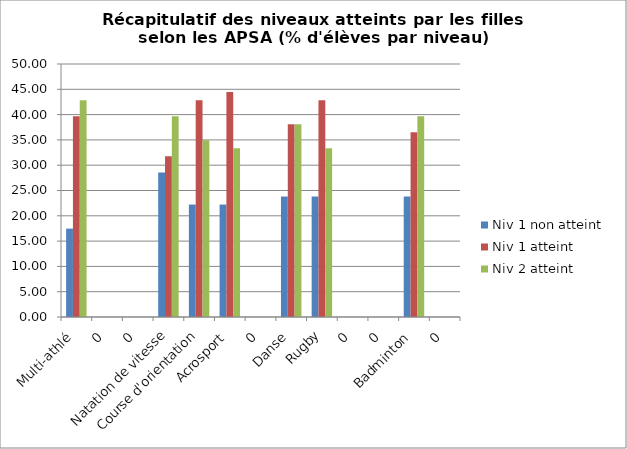
| Category | Niv 1 non atteint | Niv 1 atteint | Niv 2 atteint |
|---|---|---|---|
| Multi-athlé | 17.46 | 39.683 | 42.857 |
| 0 | 0 | 0 | 0 |
| 0 | 0 | 0 | 0 |
| Natation de vitesse | 28.571 | 31.746 | 39.683 |
| Course d'orientation | 22.222 | 42.857 | 34.921 |
| Acrosport | 22.222 | 44.444 | 33.333 |
| 0 | 0 | 0 | 0 |
| Danse | 23.81 | 38.095 | 38.095 |
| Rugby | 23.81 | 42.857 | 33.333 |
| 0 | 0 | 0 | 0 |
| 0 | 0 | 0 | 0 |
| Badminton | 23.81 | 36.508 | 39.683 |
| 0 | 0 | 0 | 0 |